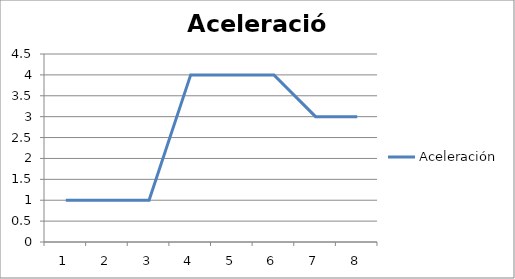
| Category | Aceleración |
|---|---|
| 0 | 1 |
| 1 | 1 |
| 2 | 1 |
| 3 | 4 |
| 4 | 4 |
| 5 | 4 |
| 6 | 3 |
| 7 | 3 |